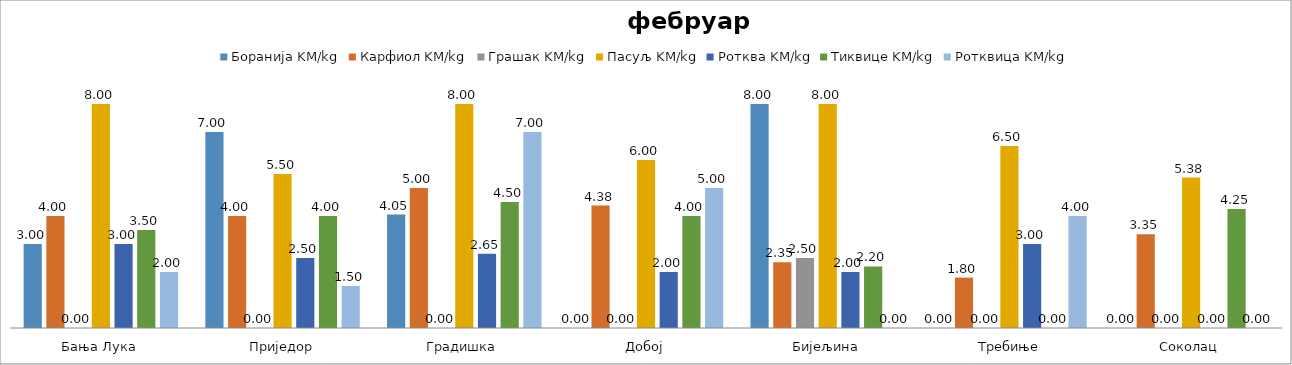
| Category | Боранија KM/kg | Карфиол KM/kg | Грашак KM/kg | Пасуљ KM/kg | Ротква KM/kg | Тиквице KM/kg | Ротквица KM/kg |
|---|---|---|---|---|---|---|---|
| Бања Лука | 3 | 4 | 0 | 8 | 3 | 3.5 | 2 |
| Приједор | 7 | 4 | 0 | 5.5 | 2.5 | 4 | 1.5 |
| Градишка | 4.05 | 5 | 0 | 8 | 2.65 | 4.5 | 7 |
| Добој | 0 | 4.375 | 0 | 6 | 2 | 4 | 5 |
| Бијељина | 8 | 2.35 | 2.5 | 8 | 2 | 2.2 | 0 |
|  Требиње | 0 | 1.8 | 0 | 6.5 | 3 | 0 | 4 |
| Соколац | 0 | 3.35 | 0 | 5.375 | 0 | 4.25 | 0 |